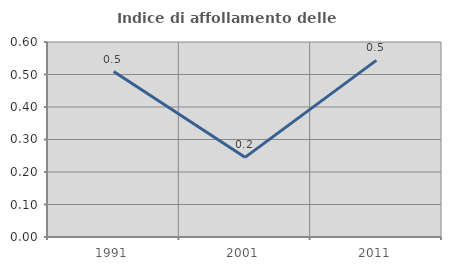
| Category | Indice di affollamento delle abitazioni  |
|---|---|
| 1991.0 | 0.509 |
| 2001.0 | 0.245 |
| 2011.0 | 0.543 |